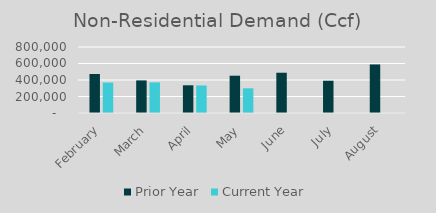
| Category | Prior Year | Current Year |
|---|---|---|
| February | 472459.203 | 369131.684 |
| March | 394966.802 | 370961.851 |
| April | 335781.44 | 333800.488 |
| May | 452130.67 | 299245.56 |
| June | 488107.52 | 0 |
| July | 390975.65 | 0 |
| August | 588468.22 | 0 |